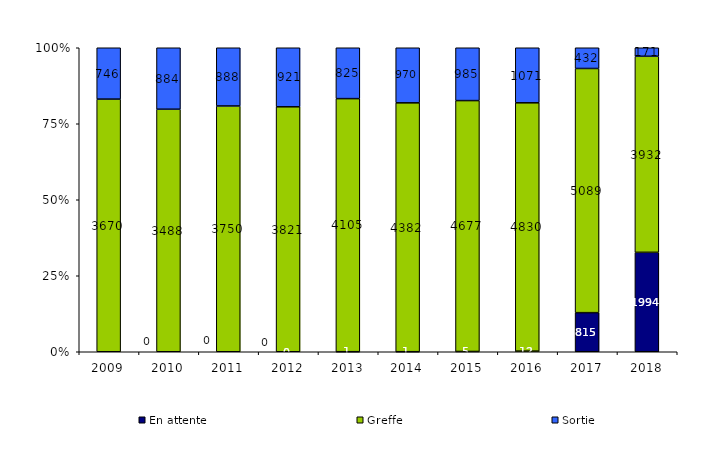
| Category | En attente | Greffe | Sortie |
|---|---|---|---|
| 2009.0 | 0 | 3670 | 746 |
| 2010.0 | 0 | 3488 | 884 |
| 2011.0 | 0 | 3750 | 888 |
| 2012.0 | 0 | 3821 | 921 |
| 2013.0 | 1 | 4105 | 825 |
| 2014.0 | 1 | 4382 | 970 |
| 2015.0 | 5 | 4677 | 985 |
| 2016.0 | 12 | 4830 | 1071 |
| 2017.0 | 815 | 5089 | 432 |
| 2018.0 | 1994 | 3932 | 171 |